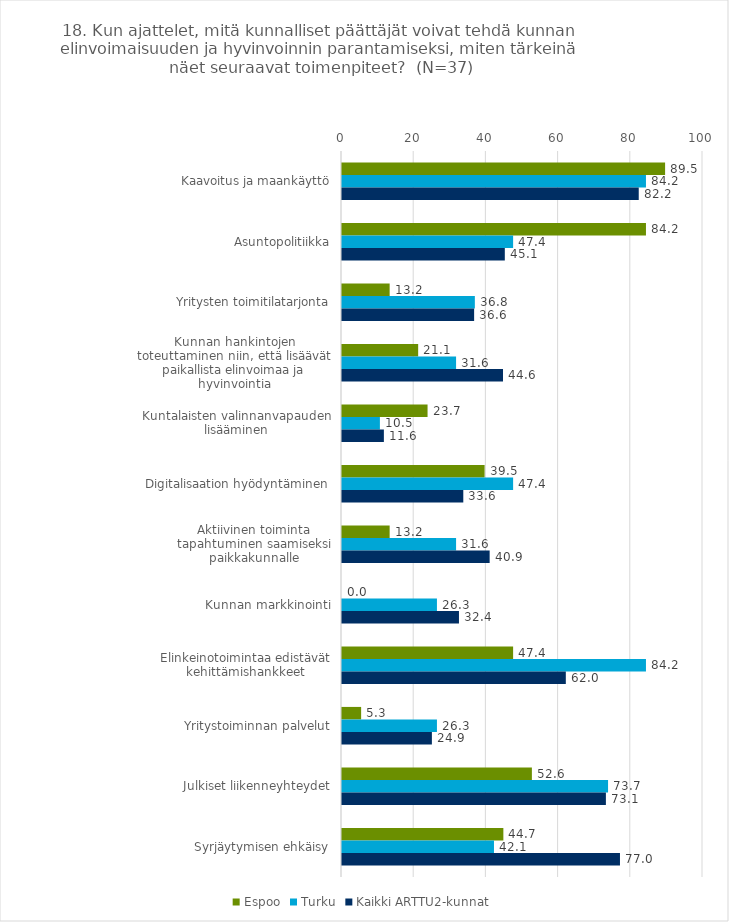
| Category | Espoo | Turku | Kaikki ARTTU2-kunnat |
|---|---|---|---|
| Kaavoitus ja maankäyttö | 89.5 | 84.2 | 82.2 |
| Asuntopolitiikka | 84.2 | 47.4 | 45.1 |
| Yritysten toimitilatarjonta | 13.2 | 36.8 | 36.6 |
| Kunnan hankintojen toteuttaminen niin, että lisäävät paikallista elinvoimaa ja hyvinvointia | 21.1 | 31.6 | 44.6 |
| Kuntalaisten valinnanvapauden lisääminen | 23.7 | 10.5 | 11.6 |
| Digitalisaation hyödyntäminen | 39.5 | 47.4 | 33.6 |
| Aktiivinen toiminta tapahtuminen saamiseksi paikkakunnalle | 13.2 | 31.6 | 40.9 |
| Kunnan markkinointi | 0 | 26.3 | 32.4 |
| Elinkeinotoimintaa edistävät kehittämishankkeet | 47.4 | 84.2 | 62 |
| Yritystoiminnan palvelut | 5.3 | 26.3 | 24.9 |
| Julkiset liikenneyhteydet | 52.6 | 73.7 | 73.1 |
| Syrjäytymisen ehkäisy | 44.7 | 42.1 | 77 |